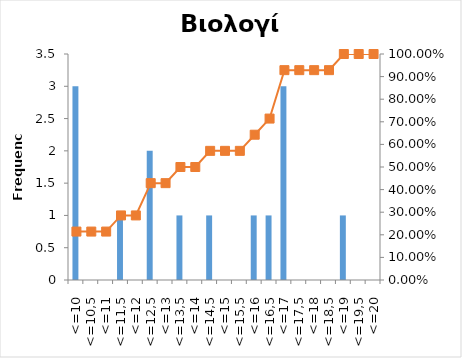
| Category | Series 0 |
|---|---|
| <=10 | 3 |
| <=10,5 | 0 |
| <=11 | 0 |
| <=11,5 | 1 |
| <=12 | 0 |
| <=12,5 | 2 |
| <=13 | 0 |
| <=13,5 | 1 |
| <=14 | 0 |
| <=14,5 | 1 |
| <=15 | 0 |
| <=15,5 | 0 |
| <=16 | 1 |
| <=16,5 | 1 |
| <=17 | 3 |
| <=17,5 | 0 |
| <=18 | 0 |
| <=18,5 | 0 |
| <=19 | 1 |
| <=19,5 | 0 |
| <=20 | 0 |